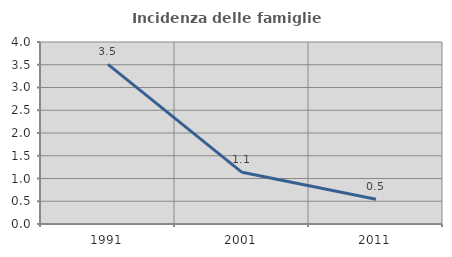
| Category | Incidenza delle famiglie numerose |
|---|---|
| 1991.0 | 3.509 |
| 2001.0 | 1.136 |
| 2011.0 | 0.543 |